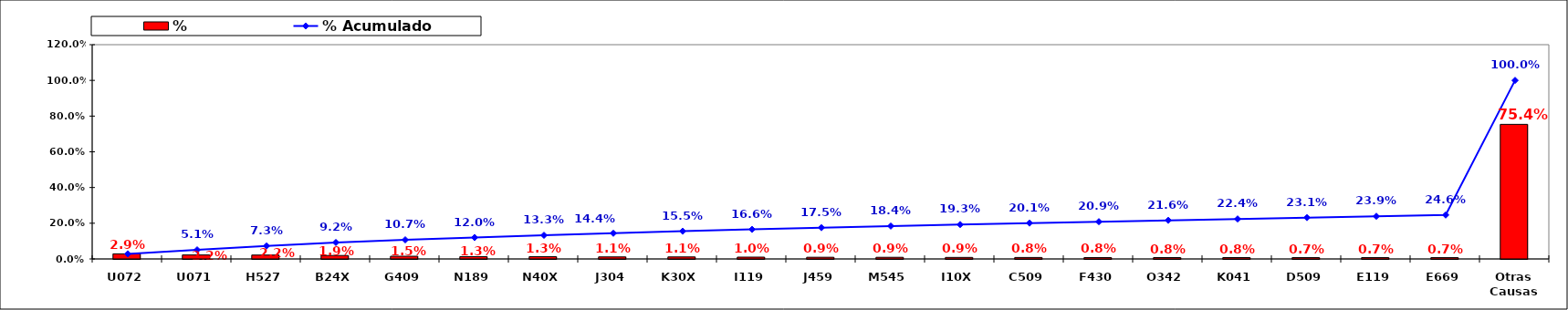
| Category | % |
|---|---|
| U072 | 0.029 |
| U071 | 0.022 |
| H527 | 0.022 |
| B24X | 0.019 |
| G409 | 0.015 |
| N189 | 0.013 |
| N40X | 0.013 |
| J304 | 0.011 |
| K30X | 0.011 |
| I119 | 0.01 |
| J459 | 0.009 |
| M545 | 0.009 |
| I10X | 0.009 |
| C509 | 0.008 |
| F430 | 0.008 |
| O342 | 0.008 |
| K041 | 0.008 |
| D509 | 0.007 |
| E119 | 0.007 |
| E669 | 0.007 |
| Otras Causas | 0.754 |